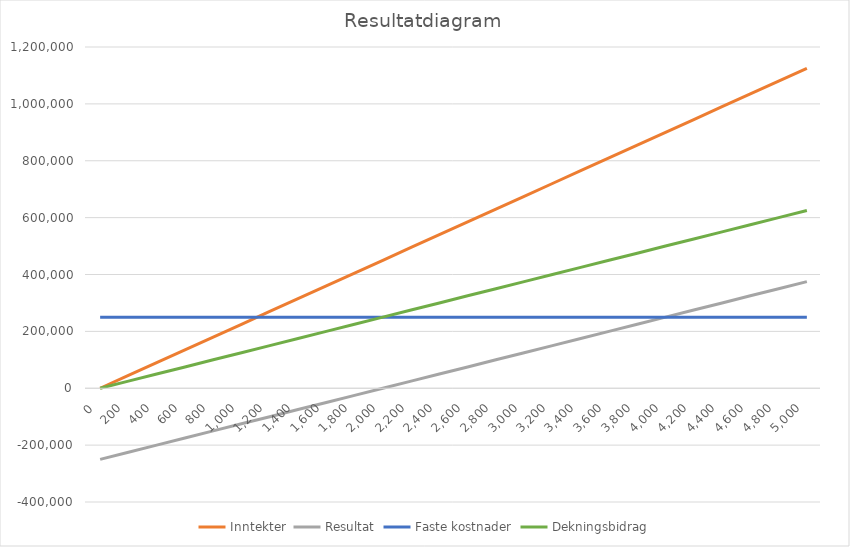
| Category | Inntekter | Resultat | Faste kostnader | Dekningsbidrag |
|---|---|---|---|---|
| 0.0 | 0 | -250000 | 250000 | 0 |
| 200.0 | 45000 | -225000 | 250000 | 25000 |
| 400.0 | 90000 | -200000 | 250000 | 50000 |
| 600.0 | 135000 | -175000 | 250000 | 75000 |
| 800.0 | 180000 | -150000 | 250000 | 100000 |
| 1000.0 | 225000 | -125000 | 250000 | 125000 |
| 1200.0 | 270000 | -100000 | 250000 | 150000 |
| 1400.0 | 315000 | -75000 | 250000 | 175000 |
| 1600.0 | 360000 | -50000 | 250000 | 200000 |
| 1800.0 | 405000 | -25000 | 250000 | 225000 |
| 2000.0 | 450000 | 0 | 250000 | 250000 |
| 2200.0 | 495000 | 25000 | 250000 | 275000 |
| 2400.0 | 540000 | 50000 | 250000 | 300000 |
| 2600.0 | 585000 | 75000 | 250000 | 325000 |
| 2800.0 | 630000 | 100000 | 250000 | 350000 |
| 3000.0 | 675000 | 125000 | 250000 | 375000 |
| 3200.0 | 720000 | 150000 | 250000 | 400000 |
| 3400.0 | 765000 | 175000 | 250000 | 425000 |
| 3600.0 | 810000 | 200000 | 250000 | 450000 |
| 3800.0 | 855000 | 225000 | 250000 | 475000 |
| 4000.0 | 900000 | 250000 | 250000 | 500000 |
| 4200.0 | 945000 | 275000 | 250000 | 525000 |
| 4400.0 | 990000 | 300000 | 250000 | 550000 |
| 4600.0 | 1035000 | 325000 | 250000 | 575000 |
| 4800.0 | 1080000 | 350000 | 250000 | 600000 |
| 5000.0 | 1125000 | 375000 | 250000 | 625000 |